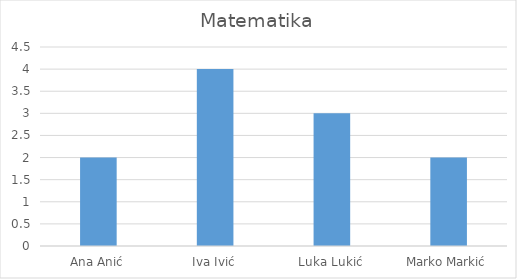
| Category | Matematika |
|---|---|
| Ana Anić | 2 |
| Iva Ivić | 4 |
| Luka Lukić | 3 |
| Marko Markić | 2 |